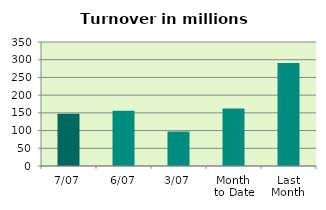
| Category | Series 0 |
|---|---|
| 7/07 | 147.236 |
| 6/07 | 156.263 |
| 3/07 | 97.256 |
| Month 
to Date | 162.312 |
| Last
Month | 290.981 |